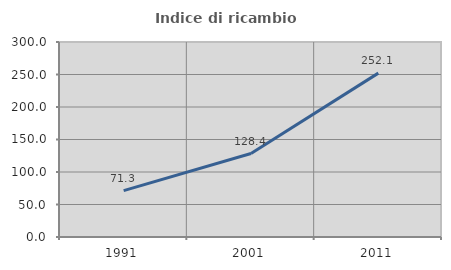
| Category | Indice di ricambio occupazionale  |
|---|---|
| 1991.0 | 71.277 |
| 2001.0 | 128.369 |
| 2011.0 | 252.128 |